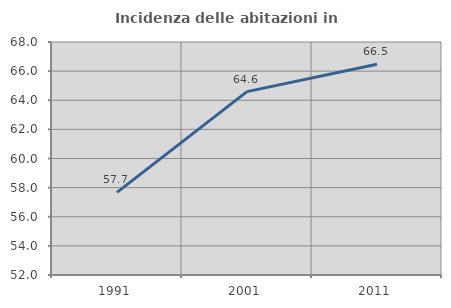
| Category | Incidenza delle abitazioni in proprietà  |
|---|---|
| 1991.0 | 57.671 |
| 2001.0 | 64.593 |
| 2011.0 | 66.476 |